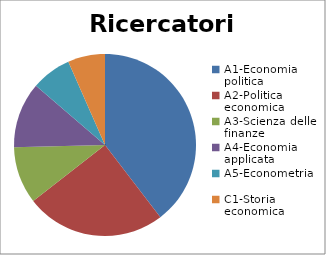
| Category | Ricercatori t.d. | Series 1 |
|---|---|---|
| A1-Economia politica | 78 |  |
| A2-Politica economica | 49 |  |
| A3-Scienza delle finanze | 20 |  |
| A4-Economia applicata | 23 |  |
| A5-Econometria | 14 |  |
| C1-Storia economica | 13 |  |